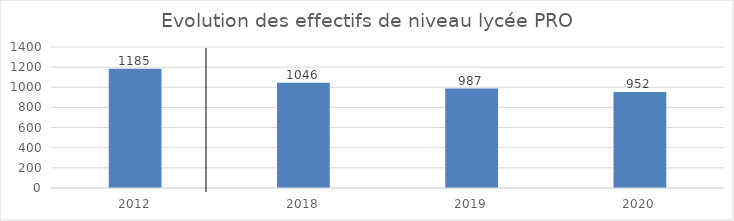
| Category | Series 0 |
|---|---|
| 2012.0 | 1185 |
| 2018.0 | 1046 |
| 2019.0 | 987 |
| 2020.0 | 952 |